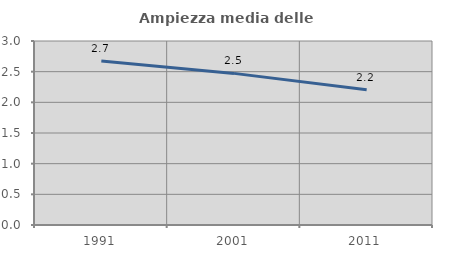
| Category | Ampiezza media delle famiglie |
|---|---|
| 1991.0 | 2.676 |
| 2001.0 | 2.472 |
| 2011.0 | 2.205 |